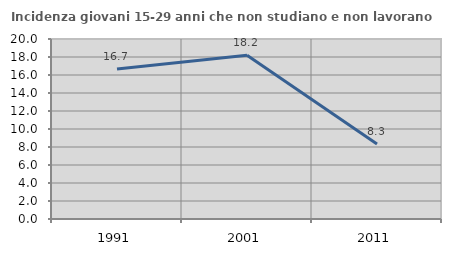
| Category | Incidenza giovani 15-29 anni che non studiano e non lavorano  |
|---|---|
| 1991.0 | 16.667 |
| 2001.0 | 18.182 |
| 2011.0 | 8.333 |